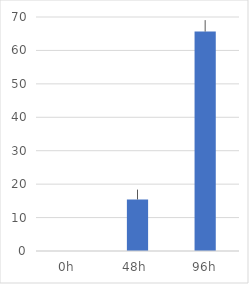
| Category | Mean |
|---|---|
| 0h  | 0 |
| 48h  | 15.42 |
| 96h | 65.63 |